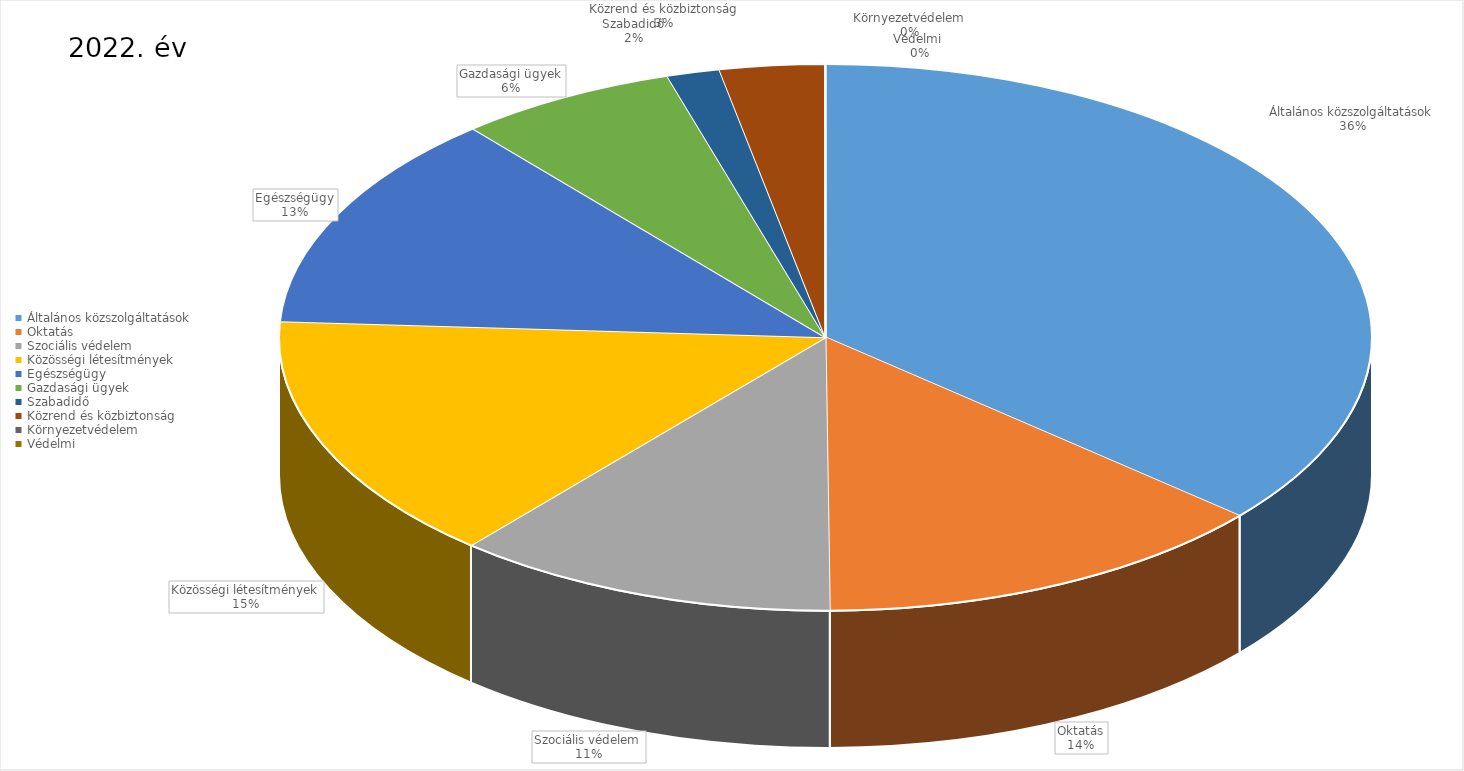
| Category | 2022. év |
|---|---|
| Általános közszolgáltatások | 13280318352 |
| Oktatás | 4956244315 |
| Szociális védelem | 4152938340 |
| Közösségi létesítmények | 5374305659 |
| Egészségügy | 4717827798 |
| Gazdasági ügyek | 2369995778 |
| Szabadidő | 572948504 |
| Közrend és közbiztonság | 1136639696 |
| Környezetvédelem | 0 |
| Védelmi  | 2486460 |